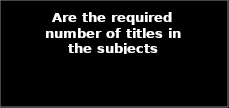
| Category | Series 0 |
|---|---|
| AVAILABLE | 0.756 |
| NOT AVAILABLE | 0.028 |
| SOMETIMES NOT AVAILABLE | 0.216 |